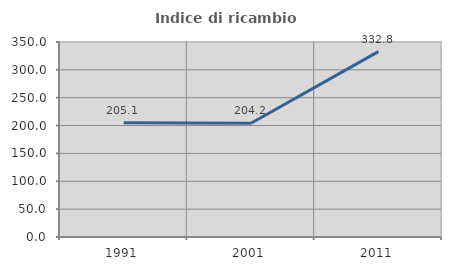
| Category | Indice di ricambio occupazionale  |
|---|---|
| 1991.0 | 205.128 |
| 2001.0 | 204.225 |
| 2011.0 | 332.8 |